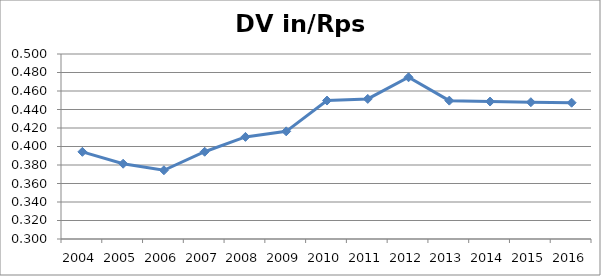
| Category | DV in/Rps ut |
|---|---|
| 2004.0 | 0.394 |
| 2005.0 | 0.381 |
| 2006.0 | 0.374 |
| 2007.0 | 0.394 |
| 2008.0 | 0.41 |
| 2009.0 | 0.416 |
| 2010.0 | 0.45 |
| 2011.0 | 0.451 |
| 2012.0 | 0.475 |
| 2013.0 | 0.45 |
| 2014.0 | 0.449 |
| 2015.0 | 0.448 |
| 2016.0 | 0.447 |